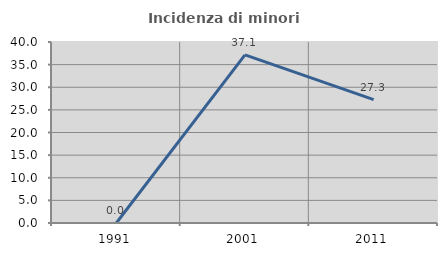
| Category | Incidenza di minori stranieri |
|---|---|
| 1991.0 | 0 |
| 2001.0 | 37.143 |
| 2011.0 | 27.273 |